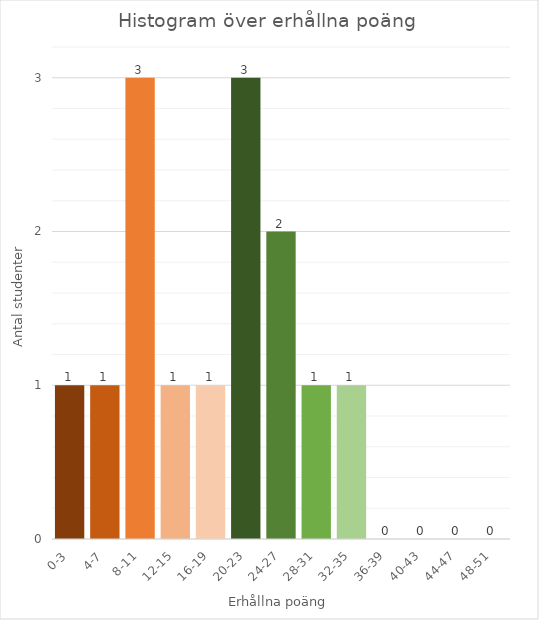
| Category | Antal
studenter |
|---|---|
| 0-3 | 1 |
| 4-7 | 1 |
| 8-11 | 3 |
| 12-15 | 1 |
| 16-19 | 1 |
| 20-23 | 3 |
| 24-27 | 2 |
| 28-31 | 1 |
| 32-35 | 1 |
| 36-39 | 0 |
| 40-43 | 0 |
| 44-47 | 0 |
| 48-51 | 0 |